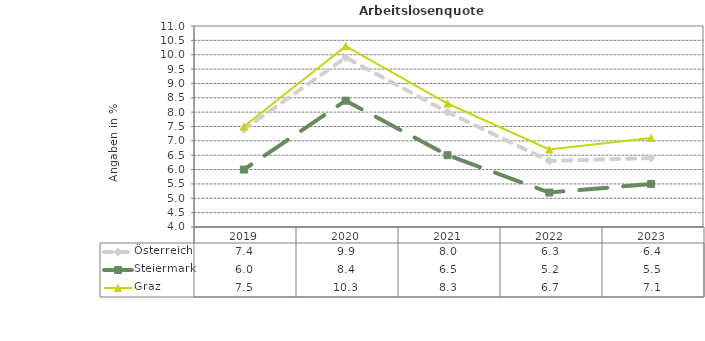
| Category | Österreich | Steiermark | Graz |
|---|---|---|---|
| 2023.0 | 6.4 | 5.5 | 7.1 |
| 2022.0 | 6.3 | 5.2 | 6.7 |
| 2021.0 | 8 | 6.5 | 8.3 |
| 2020.0 | 9.9 | 8.4 | 10.3 |
| 2019.0 | 7.4 | 6 | 7.5 |